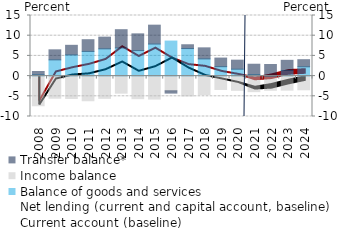
| Category | Balance of goods and services | Income balance | Transfer balance* |
|---|---|---|---|
| 2008.0 | 0.347 | -7.339 | 0.794 |
| 2009.0 | 4.02 | -5.476 | 2.482 |
| 2010.0 | 5.254 | -5.539 | 2.368 |
| 2011.0 | 6.108 | -6.103 | 2.902 |
| 2012.0 | 6.749 | -5.515 | 2.895 |
| 2013.0 | 6.968 | -4.227 | 4.519 |
| 2014.0 | 6.314 | -5.596 | 4.143 |
| 2015.0 | 7.938 | -5.69 | 4.669 |
| 2016.0 | 8.673 | -3.641 | -0.569 |
| 2017.0 | 6.818 | -4.915 | 0.941 |
| 2018.0 | 4.262 | -4.583 | 2.73 |
| 2019.0 | 2.333 | -3.31 | 2.131 |
| 2020.0 | 1.714 | -3.524 | 2.232 |
| 2021.0 | 0.386 | -3.854 | 2.553 |
| 2022.0 | -0.018 | -3.493 | 2.868 |
| 2023.0 | 1.382 | -3.481 | 2.525 |
| 2024.0 | 2.305 | -3.386 | 1.754 |